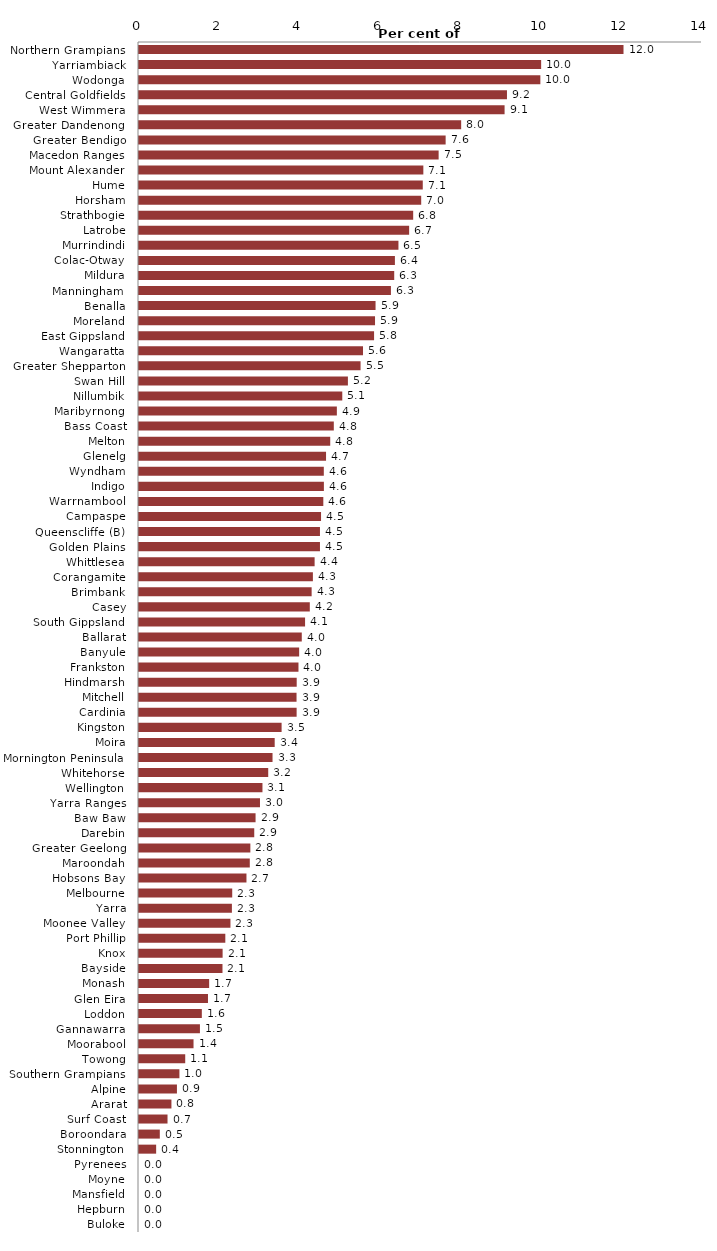
| Category | Series 0 |
|---|---|
| Northern Grampians | 12.048 |
| Yarriambiack | 10 |
| Wodonga | 9.98 |
| Central Goldfields | 9.15 |
| West Wimmera | 9.091 |
| Greater Dandenong | 8.011 |
| Greater Bendigo | 7.625 |
| Macedon Ranges | 7.451 |
| Mount Alexander | 7.071 |
| Hume | 7.057 |
| Horsham | 7.018 |
| Strathbogie | 6.818 |
| Latrobe | 6.718 |
| Murrindindi | 6.452 |
| Colac-Otway | 6.364 |
| Mildura | 6.346 |
| Manningham | 6.265 |
| Benalla | 5.882 |
| Moreland | 5.869 |
| East Gippsland | 5.846 |
| Wangaratta | 5.57 |
| Greater Shepparton | 5.51 |
| Swan Hill | 5.195 |
| Nillumbik | 5.055 |
| Maribyrnong | 4.92 |
| Bass Coast | 4.844 |
| Melton | 4.755 |
| Glenelg | 4.651 |
| Wyndham | 4.596 |
| Indigo | 4.598 |
| Warrnambool | 4.583 |
| Campaspe | 4.527 |
| Queenscliffe (B) | 4.5 |
| Golden Plains | 4.5 |
| Whittlesea | 4.367 |
| Corangamite | 4.324 |
| Brimbank | 4.293 |
| Casey | 4.247 |
| South Gippsland | 4.13 |
| Ballarat | 4.048 |
| Banyule | 3.983 |
| Frankston | 3.966 |
| Hindmarsh | 3.922 |
| Mitchell | 3.918 |
| Cardinia | 3.92 |
| Kingston | 3.546 |
| Moira | 3.374 |
| Mornington Peninsula | 3.321 |
| Whitehorse | 3.213 |
| Wellington | 3.07 |
| Yarra Ranges | 3.008 |
| Baw Baw | 2.899 |
| Darebin | 2.866 |
| Greater Geelong | 2.769 |
| Maroondah | 2.755 |
| Hobsons Bay | 2.672 |
| Melbourne | 2.318 |
| Yarra | 2.31 |
| Moonee Valley | 2.274 |
| Port Phillip | 2.146 |
| Knox | 2.079 |
| Bayside | 2.076 |
| Monash | 1.744 |
| Glen Eira | 1.716 |
| Loddon | 1.562 |
| Gannawarra | 1.515 |
| Moorabool | 1.356 |
| Towong | 1.149 |
| Southern Grampians | 1.005 |
| Alpine | 0.943 |
| Ararat | 0.806 |
| Surf Coast | 0.709 |
| Boroondara | 0.517 |
| Stonnington | 0.426 |
| Pyrenees | 0 |
| Moyne | 0 |
| Mansfield | 0 |
| Hepburn | 0 |
| Buloke | 0 |